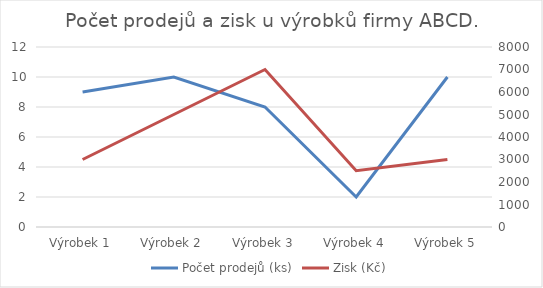
| Category | Počet prodejů (ks) |
|---|---|
| Výrobek 1 | 9 |
| Výrobek 2 | 10 |
| Výrobek 3 | 8 |
| Výrobek 4 | 2 |
| Výrobek 5 | 10 |